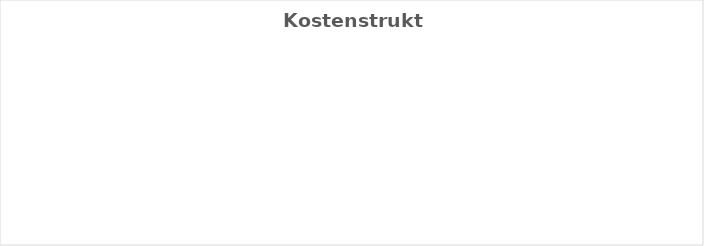
| Category | Series 0 |
|---|---|
| KV-Entgelt produktiv Tätige | 0 |
| Weitere Personalkosten produktiv | 0 |
| Personalnebenkosten | 0 |
| Unproduktives Personal | 0 |
| Deckung Personalgemeinkosten | 0 |
| Umlagen ohne GZ | 0 |
| Gesamtzuschlag | 0 |